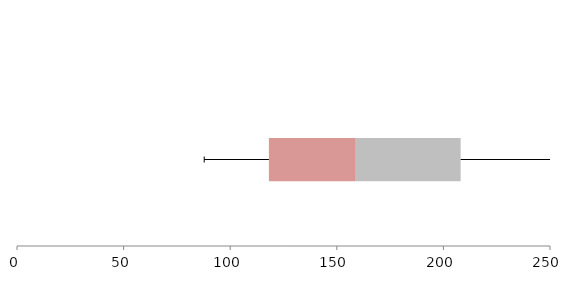
| Category | Series 1 | Series 2 | Series 3 |
|---|---|---|---|
| 0 | 118.16 | 40.748 | 49.179 |